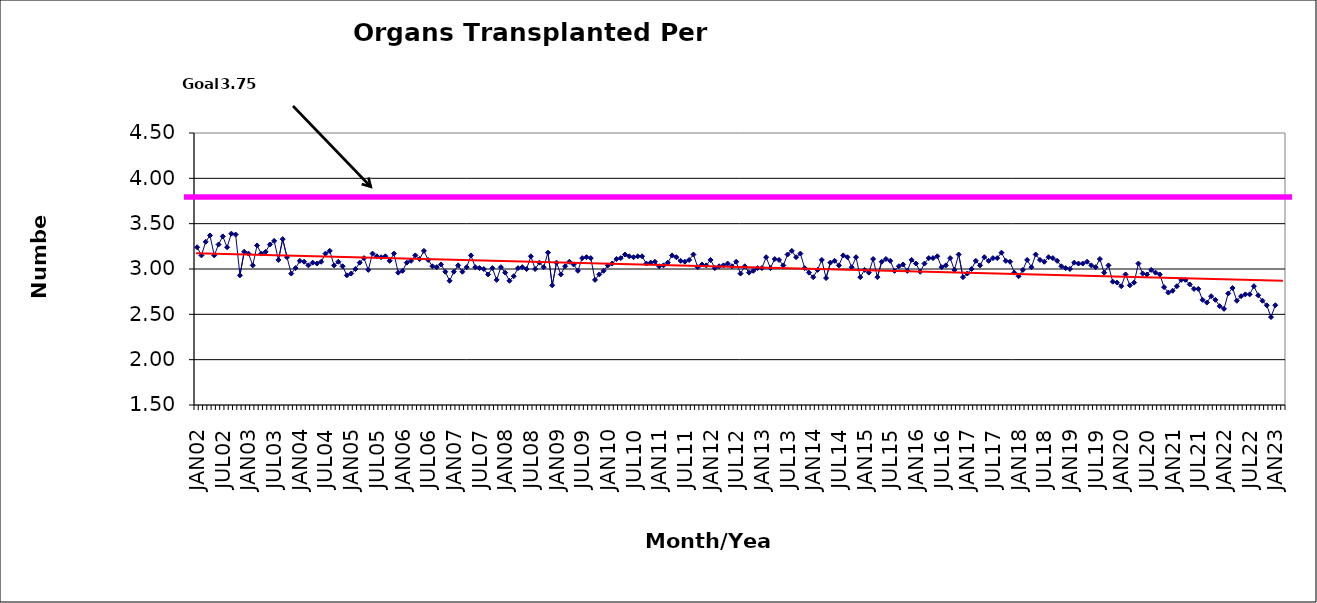
| Category | Series 0 |
|---|---|
| JAN02 | 3.24 |
| FEB02 | 3.15 |
| MAR02 | 3.3 |
| APR02 | 3.37 |
| MAY02 | 3.15 |
| JUN02 | 3.27 |
| JUL02 | 3.36 |
| AUG02 | 3.24 |
| SEP02 | 3.39 |
| OCT02 | 3.38 |
| NOV02 | 2.93 |
| DEC02 | 3.19 |
| JAN03 | 3.17 |
| FEB03 | 3.04 |
| MAR03 | 3.26 |
| APR03 | 3.17 |
| MAY03 | 3.19 |
| JUN03 | 3.27 |
| JUL03 | 3.31 |
| AUG03 | 3.1 |
| SEP03 | 3.33 |
| OCT03 | 3.13 |
| NOV03 | 2.95 |
| DEC03 | 3.01 |
| JAN04 | 3.09 |
| FEB04 | 3.08 |
| MAR04 | 3.04 |
| APR04 | 3.07 |
| MAY04 | 3.06 |
| JUN04 | 3.08 |
| JUL04 | 3.17 |
| AUG04 | 3.2 |
| SEP04 | 3.04 |
| OCT04 | 3.08 |
| NOV04 | 3.03 |
| DEC04 | 2.93 |
| JAN05 | 2.95 |
| FEB05 | 3 |
| MAR05 | 3.07 |
| APR05 | 3.12 |
| MAY05 | 2.99 |
| JUN05 | 3.17 |
| JUL05 | 3.14 |
| AUG05 | 3.13 |
| SEP05 | 3.14 |
| OCT05 | 3.09 |
| NOV05 | 3.17 |
| DEC05 | 2.96 |
| JAN06 | 2.98 |
| FEB06 | 3.07 |
| MAR06 | 3.09 |
| APR06 | 3.15 |
| MAY06 | 3.11 |
| JUN06 | 3.2 |
| JUL06 | 3.1 |
| AUG06 | 3.03 |
| SEP06 | 3.02 |
| OCT06 | 3.05 |
| NOV06 | 2.97 |
| DEC06 | 2.87 |
| JAN07 | 2.97 |
| FEB07 | 3.04 |
| MAR07 | 2.97 |
| APR07 | 3.02 |
| MAY07 | 3.15 |
| JUN07 | 3.02 |
| JUL07 | 3.01 |
| AUG07 | 3 |
| SEP07 | 2.94 |
| OCT07 | 3.01 |
| NOV07 | 2.88 |
| DEC07 | 3.02 |
| JAN08 | 2.96 |
| FEB08 | 2.87 |
| MAR08 | 2.92 |
| APR08 | 3.01 |
| MAY08 | 3.02 |
| JUN08 | 3 |
| JUL08 | 3.14 |
| AUG08 | 3 |
| SEP08 | 3.07 |
| OCT08 | 3.02 |
| NOV08 | 3.18 |
| DEC08 | 2.82 |
| JAN09 | 3.07 |
| FEB09 | 2.94 |
| MAR09 | 3.03 |
| APR09 | 3.08 |
| MAY09 | 3.05 |
| JUN09 | 2.98 |
| JUL09 | 3.12 |
| AUG09 | 3.13 |
| SEP09 | 3.12 |
| OCT09 | 2.88 |
| NOV09 | 2.94 |
| DEC09 | 2.98 |
| JAN10 | 3.04 |
| FEB10 | 3.06 |
| MAR10 | 3.11 |
| APR10 | 3.12 |
| MAY10 | 3.16 |
| JUN10 | 3.14 |
| JUL10 | 3.13 |
| AUG10 | 3.14 |
| SEP10 | 3.14 |
| OCT10 | 3.06 |
| NOV10 | 3.07 |
| DEC10 | 3.08 |
| JAN11 | 3.03 |
| FEB11 | 3.04 |
| MAR11 | 3.07 |
| APR11 | 3.15 |
| MAY11 | 3.13 |
| JUN11 | 3.09 |
| JUL11 | 3.08 |
| AUG11 | 3.1 |
| SEP11 | 3.16 |
| OCT11 | 3.02 |
| NOV11 | 3.05 |
| DEC11 | 3.04 |
| JAN12 | 3.1 |
| FEB12 | 3.01 |
| MAR12 | 3.03 |
| APR12 | 3.04 |
| MAY12 | 3.06 |
| JUN12 | 3.03 |
| JUL12 | 3.08 |
| AUG12 | 2.95 |
| SEP12 | 3.03 |
| OCT12 | 2.96 |
| NOV12 | 2.98 |
| DEC12 | 3.01 |
| JAN13 | 3.01 |
| FEB13 | 3.13 |
| MAR13 | 3.01 |
| APR13 | 3.11 |
| MAY13 | 3.1 |
| JUN13 | 3.04 |
| JUL13 | 3.16 |
| AUG13 | 3.2 |
| SEP13 | 3.13 |
| OCT13 | 3.17 |
| NOV13 | 3.01 |
| DEC13 | 2.96 |
| JAN14 | 2.91 |
| FEB14 | 2.99 |
| MAR14 | 3.1 |
| APR14 | 2.9 |
| MAY14 | 3.07 |
| JUN14 | 3.09 |
| JUL14 | 3.04 |
| AUG14 | 3.15 |
| SEP14 | 3.13 |
| OCT14 | 3.02 |
| NOV14 | 3.13 |
| DEC14 | 2.91 |
| JAN15 | 2.99 |
| FEB15 | 2.96 |
| MAR15 | 3.11 |
| APR15 | 2.91 |
| MAY15 | 3.08 |
| JUN15 | 3.11 |
| JUL15 | 3.09 |
| AUG15 | 2.98 |
| SEP15 | 3.03 |
| OCT15 | 3.05 |
| NOV15 | 2.98 |
| DEC15 | 3.1 |
| JAN16 | 3.06 |
| FEB16 | 2.97 |
| MAR16 | 3.06 |
| APR16 | 3.12 |
| MAY16 | 3.12 |
| JUN16 | 3.14 |
| JUL16 | 3.02 |
| AUG16 | 3.04 |
| SEP16 | 3.12 |
| OCT16 | 2.99 |
| NOV16 | 3.16 |
| DEC16 | 2.91 |
| JAN17 | 2.95 |
| FEB17 | 3 |
| MAR17 | 3.09 |
| APR17 | 3.04 |
| MAY17 | 3.13 |
| JUN17 | 3.09 |
| JUL17 | 3.12 |
| AUG17 | 3.12 |
| SEP17 | 3.18 |
| OCT17 | 3.09 |
| NOV17 | 3.08 |
| DEC17 | 2.96 |
| JAN18 | 2.92 |
| FEB18 | 2.99 |
| MAR18 | 3.1 |
| APR18 | 3.02 |
| MAY18 | 3.16 |
| JUN18 | 3.1 |
| JUL18 | 3.08 |
| AUG18 | 3.13 |
| SEP18 | 3.12 |
| OCT18 | 3.09 |
| NOV18 | 3.03 |
| DEC18 | 3.01 |
| JAN19 | 3 |
| FEB19 | 3.07 |
| MAR19 | 3.06 |
| APR19 | 3.06 |
| MAY19 | 3.08 |
| JUN19 | 3.04 |
| JUL19 | 3.02 |
| AUG19 | 3.11 |
| SEP19 | 2.96 |
| OCT19 | 3.04 |
| NOV19 | 2.86 |
| DEC19 | 2.85 |
| JAN20 | 2.81 |
| FEB20 | 2.94 |
| MAR20 | 2.82 |
| APR20 | 2.85 |
| MAY20 | 3.06 |
| JUN20 | 2.95 |
| JUL20 | 2.94 |
| AUG20 | 2.99 |
| SEP20 | 2.96 |
| OCT20 | 2.94 |
| NOV20 | 2.8 |
| DEC20 | 2.74 |
| JAN21 | 2.76 |
| FEB21 | 2.81 |
| MAR21 | 2.88 |
| APR21 | 2.88 |
| MAY21 | 2.83 |
| JUN21 | 2.78 |
| JUL21 | 2.78 |
| AUG21 | 2.66 |
| SEP21 | 2.63 |
| OCT21 | 2.7 |
| NOV21 | 2.66 |
| DEC21 | 2.59 |
| JAN22 | 2.56 |
| FEB22 | 2.73 |
| MAR22 | 2.79 |
| APR22 | 2.65 |
| MAY22 | 2.7 |
| JUN22 | 2.72 |
| JUL22 | 2.72 |
| AUG22 | 2.81 |
| SEP22 | 2.71 |
| OCT22 | 2.65 |
| NOV22 | 2.6 |
| DEC22 | 2.47 |
| JAN23 | 2.6 |